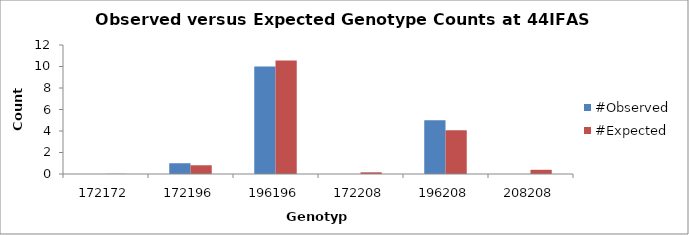
| Category | #Observed | #Expected |
|---|---|---|
| 172172.0 | 0 | 0.016 |
| 172196.0 | 1 | 0.812 |
| 196196.0 | 10 | 10.562 |
| 172208.0 | 0 | 0.156 |
| 196208.0 | 5 | 4.062 |
| 208208.0 | 0 | 0.391 |